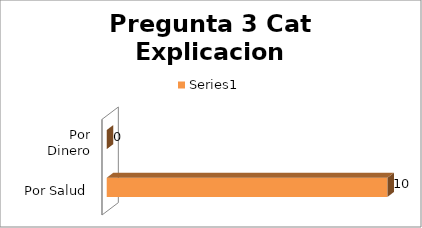
| Category | Series 0 |
|---|---|
| Por Salud | 10 |
| Por Dinero | 0 |